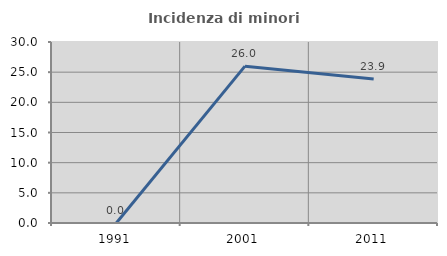
| Category | Incidenza di minori stranieri |
|---|---|
| 1991.0 | 0 |
| 2001.0 | 26 |
| 2011.0 | 23.881 |